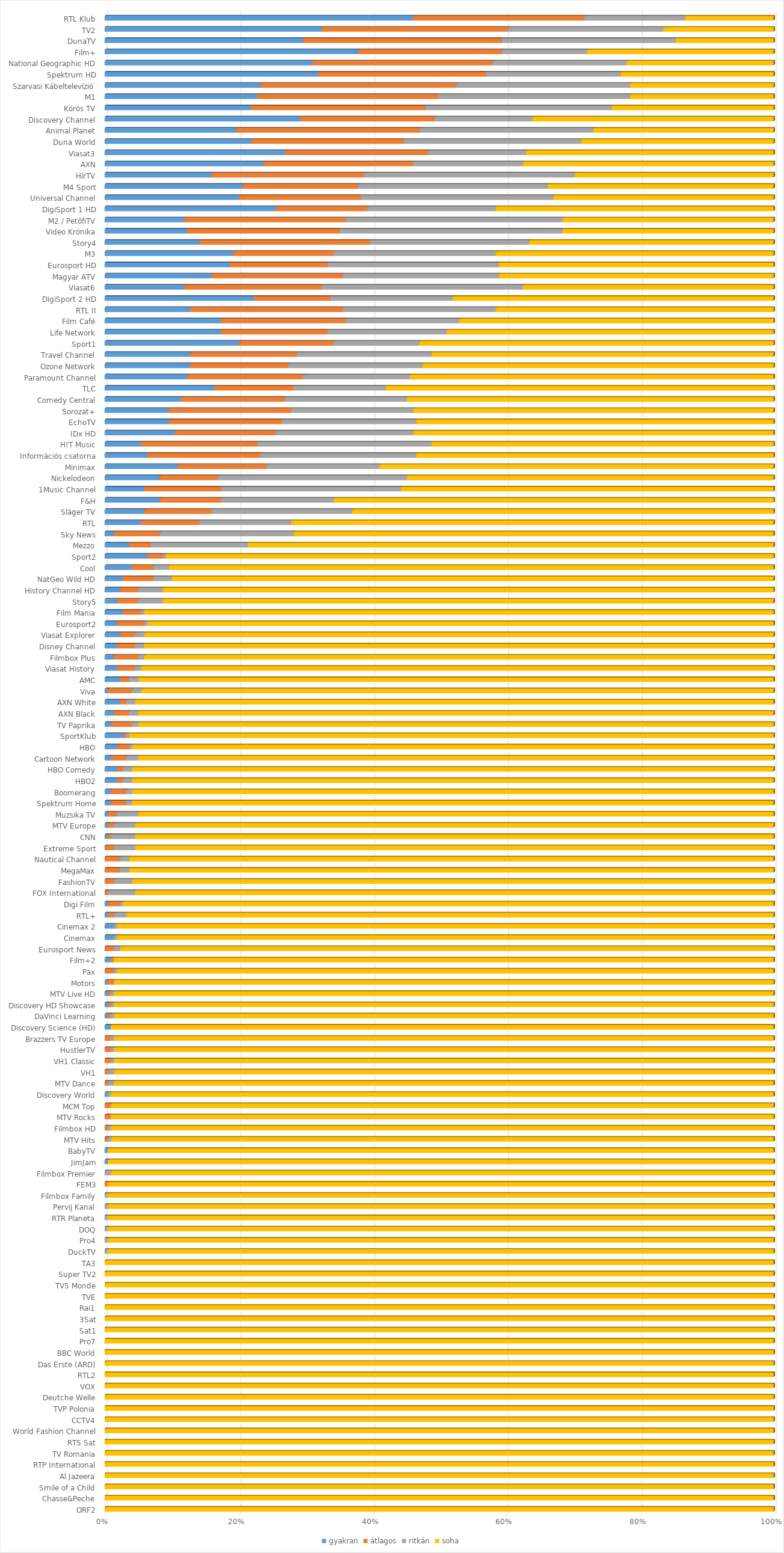
| Category | gyakran | átlagos | ritkán | soha |
|---|---|---|---|---|
| ORF2 | 0 | 0 | 0 | 219 |
| Chasse&Peche | 0 | 0 | 0 | 219 |
| Smile of a Child | 0 | 0 | 0 | 219 |
| Al Jazeera | 0 | 0 | 0 | 219 |
| RTP International | 0 | 0 | 0 | 219 |
| TV Romania | 0 | 0 | 0 | 219 |
| RTS Sat | 0 | 0 | 0 | 219 |
| World Fashion Channel | 0 | 0 | 0 | 219 |
| CCTV4 | 0 | 0 | 0 | 219 |
| TVP Polonia | 0 | 0 | 0 | 219 |
| Deutche Welle | 0 | 0 | 0 | 219 |
| VOX | 0 | 0 | 0 | 219 |
| RTL2 | 0 | 0 | 0 | 219 |
| Das Erste (ARD) | 0 | 0 | 0 | 219 |
| BBC World | 0 | 0 | 0 | 219 |
| Pro7 | 0 | 0 | 0 | 219 |
| Sat1 | 0 | 0 | 0 | 219 |
| 3Sat | 0 | 0 | 0 | 219 |
| Rai1 | 0 | 0 | 0 | 219 |
| TVE | 0 | 0 | 0 | 219 |
| TV5 Monde | 0 | 0 | 0 | 219 |
| Super TV2 | 0 | 0 | 0 | 219 |
| TA3 | 0 | 0 | 0 | 219 |
| DuckTV | 0 | 0 | 1 | 218 |
| Pro4 | 0 | 0 | 1 | 218 |
| DOQ | 0 | 0 | 1 | 218 |
| RTR Planeta | 0 | 0 | 1 | 218 |
| Pervij Kanal | 0 | 0 | 1 | 218 |
| Filmbox Family | 0 | 0 | 1 | 218 |
| FEM3 | 0 | 1 | 0 | 218 |
| Filmbox Premier | 0 | 0 | 2 | 217 |
| JimJam | 1 | 0 | 0 | 218 |
| BabyTV | 1 | 0 | 0 | 218 |
| MTV Hits | 0 | 1 | 1 | 217 |
| Filmbox HD | 0 | 1 | 1 | 217 |
| MTV Rocks | 0 | 2 | 0 | 217 |
| MCM Top | 0 | 2 | 0 | 217 |
| Discovery World | 1 | 0 | 1 | 217 |
| MTV Dance | 0 | 1 | 2 | 216 |
| VH1 | 0 | 1 | 2 | 216 |
| VH1 Classic | 0 | 2 | 1 | 216 |
| HustlerTV | 0 | 2 | 1 | 216 |
| Brazzers TV Europe | 0 | 2 | 1 | 216 |
| Discovery Science (HD) | 2 | 0 | 0 | 217 |
| DaVinci Learning | 1 | 1 | 1 | 216 |
| Discovery HD Showcase | 1 | 1 | 1 | 216 |
| MTV Live HD | 1 | 1 | 1 | 216 |
| Motors | 1 | 2 | 0 | 216 |
| Pax | 0 | 3 | 1 | 215 |
| Film+2 | 2 | 1 | 0 | 216 |
| Eurosport News | 0 | 3 | 2 | 214 |
| Cinemax | 3 | 0 | 1 | 215 |
| Cinemax 2 | 3 | 0 | 1 | 215 |
| RTL+ | 1 | 2 | 4 | 212 |
| Digi Film | 1 | 4 | 1 | 213 |
| FOX International | 0 | 1 | 9 | 209 |
| FashionTV | 0 | 3 | 6 | 210 |
| MegaMax | 0 | 5 | 3 | 211 |
| Nautical Channel | 0 | 5 | 3 | 211 |
| Extreme Sport | 0 | 3 | 7 | 209 |
| CNN | 1 | 1 | 8 | 209 |
| MTV Europe | 1 | 2 | 7 | 209 |
| Muzsika TV | 1 | 3 | 7 | 208 |
| Spektrum Home | 2 | 5 | 2 | 210 |
| Boomerang | 2 | 5 | 2 | 210 |
| HBO2 | 4 | 2 | 3 | 210 |
| HBO Comedy | 4 | 2 | 3 | 210 |
| Cartoon Network | 2 | 5 | 4 | 208 |
| HBO | 4 | 4 | 1 | 210 |
| SportKlub | 6 | 1 | 1 | 211 |
| TV Paprika | 2 | 7 | 2 | 208 |
| AXN Black | 3 | 5 | 3 | 208 |
| AXN White | 5 | 2 | 3 | 209 |
| Viva | 1 | 8 | 3 | 207 |
| AMC | 5 | 3 | 3 | 208 |
| Viasat History | 4 | 6 | 2 | 207 |
| Filmbox Plus | 3 | 8 | 2 | 206 |
| Disney Channel | 4 | 6 | 3 | 206 |
| Viasat Explorer | 5 | 5 | 3 | 206 |
| Eurosport2 | 4 | 9 | 1 | 205 |
| Film Mania | 6 | 6 | 1 | 206 |
| Story5 | 4 | 7 | 8 | 200 |
| History Channel HD | 5 | 6 | 8 | 200 |
| NatGeo Wild HD | 6 | 10 | 6 | 197 |
| Cool | 9 | 7 | 5 | 198 |
| Sport2 | 14 | 5 | 1 | 199 |
| Mezzo | 8 | 7 | 32 | 172 |
| Sky News | 3 | 15 | 44 | 157 |
| RTL | 12 | 19 | 30 | 158 |
| Sláger TV | 13 | 22 | 46 | 138 |
| F&H | 18 | 20 | 37 | 144 |
| 1Music Channel | 13 | 25 | 59 | 122 |
| Nickelodeon | 18 | 19 | 62 | 120 |
| Minimax | 24 | 29 | 37 | 129 |
| Információs csatorna | 14 | 37 | 51 | 117 |
| H!T Music | 12 | 38 | 57 | 112 |
| IDx HD | 23 | 33 | 45 | 118 |
| EchoTV | 21 | 37 | 44 | 117 |
| Sorozat+ | 21 | 40 | 40 | 118 |
| Comedy Central | 25 | 34 | 40 | 120 |
| TLC | 36 | 26 | 30 | 127 |
| Paramount Channel | 27 | 38 | 35 | 119 |
| Ozone Network | 28 | 32 | 44 | 115 |
| Travel Channel | 28 | 35 | 44 | 112 |
| Sport1 | 44 | 31 | 28 | 116 |
| Life Network | 38 | 35 | 39 | 107 |
| Film Café | 38 | 41 | 37 | 103 |
| RTL II | 28 | 50 | 50 | 91 |
| DigiSport 2 HD | 49 | 25 | 40 | 105 |
| Viasat6 | 26 | 45 | 66 | 82 |
| Magyar ATV | 35 | 43 | 51 | 90 |
| Eurosport HD | 41 | 32 | 56 | 90 |
| M3 | 42 | 33 | 53 | 91 |
| Story4 | 31 | 56 | 52 | 80 |
| Video Krónika | 27 | 50 | 73 | 69 |
| M2 / PetőfiTV | 26 | 53 | 71 | 69 |
| DigiSport 1 HD | 56 | 30 | 42 | 91 |
| Universal Channel | 44 | 40 | 63 | 72 |
| M4 Sport | 45 | 38 | 62 | 74 |
| HírTV | 35 | 50 | 69 | 65 |
| AXN | 52 | 49 | 36 | 82 |
| Viasat3 | 59 | 47 | 32 | 81 |
| Duna World | 48 | 50 | 58 | 63 |
| Animal Planet | 43 | 60 | 57 | 59 |
| Discovery Channel | 64 | 44 | 32 | 79 |
| Körös TV | 48 | 57 | 61 | 53 |
| M1 | 50 | 59 | 63 | 47 |
| Szarvasi Kábeltelevízió | 51 | 64 | 57 | 47 |
| Spektrum HD | 70 | 55 | 44 | 50 |
| National Geographic HD | 68 | 59 | 44 | 48 |
| Film+ | 83 | 47 | 28 | 61 |
| DunaTV | 65 | 65 | 57 | 32 |
| TV2 | 71 | 61 | 51 | 36 |
| RTL Klub | 101 | 56 | 33 | 29 |